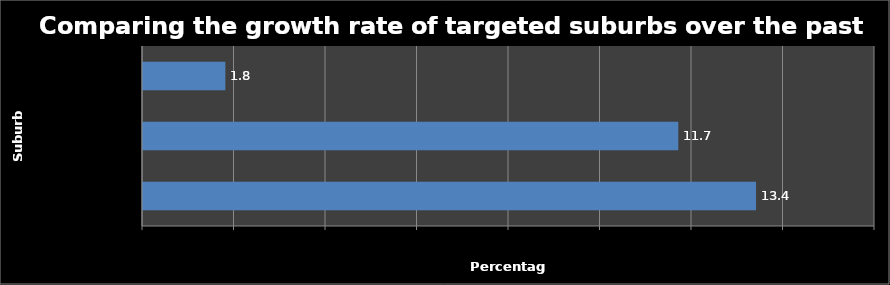
| Category | Grow rate (Percentage) |
|---|---|
| Heathridge | 13.4 |
| Beldon | 11.7 |
| West Perth | 1.8 |